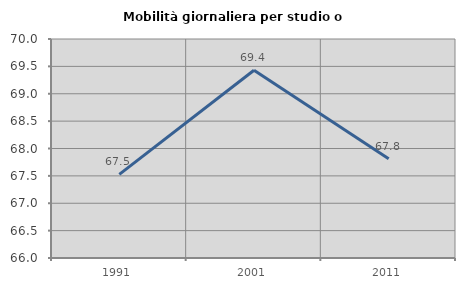
| Category | Mobilità giornaliera per studio o lavoro |
|---|---|
| 1991.0 | 67.527 |
| 2001.0 | 69.429 |
| 2011.0 | 67.813 |